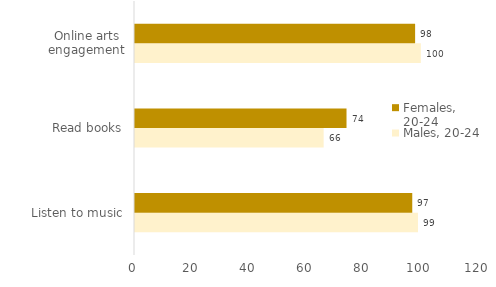
| Category | Males, 20-24 | Females, 20-24 |
|---|---|---|
| Listen to music | 99 | 97 |
| Read books | 66 | 74 |
| Online arts engagement | 100 | 98 |